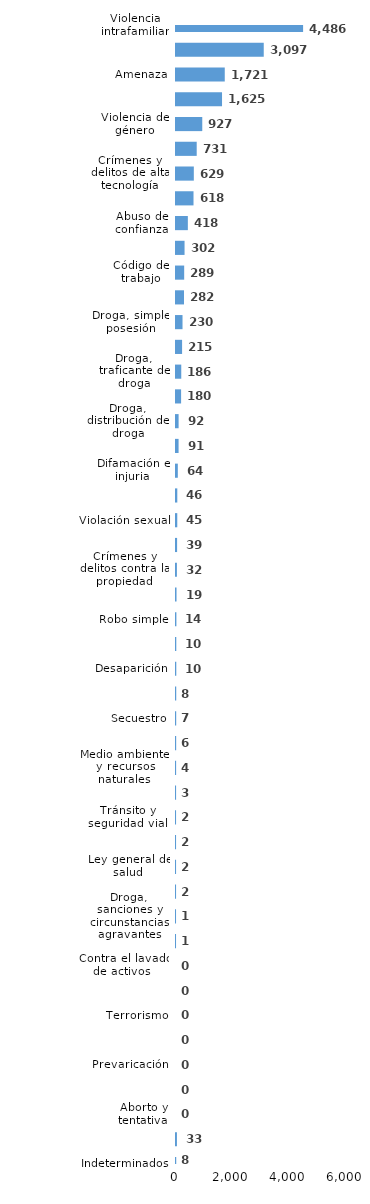
| Category | Series 0 |
|---|---|
| Violencia intrafamiliar | 4486 |
| Robo calificado | 3097 |
| Amenaza | 1721 |
| Golpes y heridas | 1625 |
| Violencia de género | 927 |
| Código del menor NNA | 731 |
| Crímenes y delitos de alta tecnología | 629 |
| Daños y perjuicios a la cosa ajena | 618 |
| Abuso de confianza | 418 |
| Agresión sexual | 302 |
| Código de trabajo | 289 |
| Ley de armas | 282 |
| Droga, simple posesión | 230 |
| Estafa | 215 |
| Droga, traficante de droga | 186 |
| Asociación de malhechores | 180 |
| Droga, distribución de droga | 92 |
| Homicidio | 91 |
| Difamación e injuria | 64 |
| Protección animal y tenencia responsable | 46 |
| Violación sexual | 45 |
| Falsificación | 39 |
| Crímenes y delitos contra la propiedad | 32 |
| Juegos de azar | 19 |
| Robo simple | 14 |
| Tentativa de homicidio | 10 |
| Desaparición | 10 |
| Pérdida de documento de identidad | 8 |
| Secuestro | 7 |
| Propiedad industrial, intelectual y derecho de autor | 6 |
| Medio ambiente y recursos naturales | 4 |
| Ley de cheques | 3 |
| Tránsito y seguridad vial  | 2 |
| Tráfico ilícito de migrantes y trata de personas | 2 |
| Ley general de salud | 2 |
| Derechos humanos | 2 |
| Droga, sanciones y circunstancias agravantes | 1 |
| Conflictos sociales | 1 |
| Contra el lavado de activos  | 0 |
| Proxenetismo | 0 |
| Terrorismo | 0 |
| Soborno | 0 |
| Prevaricación | 0 |
| Droga, delitos y sanciones | 0 |
| Aborto y tentativa | 0 |
| Otros | 33 |
| Indeterminados | 8 |